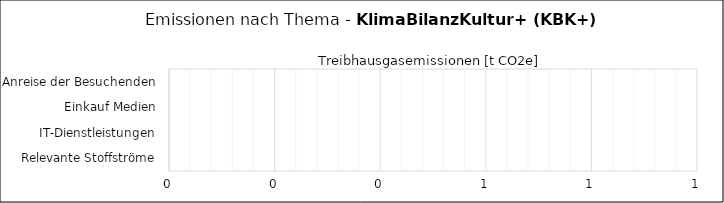
| Category | Series 0 |
|---|---|
| Anreise der Besuchenden | 0 |
| Einkauf Medien | 0 |
| IT-Dienstleistungen | 0 |
| Relevante Stoffströme | 0 |